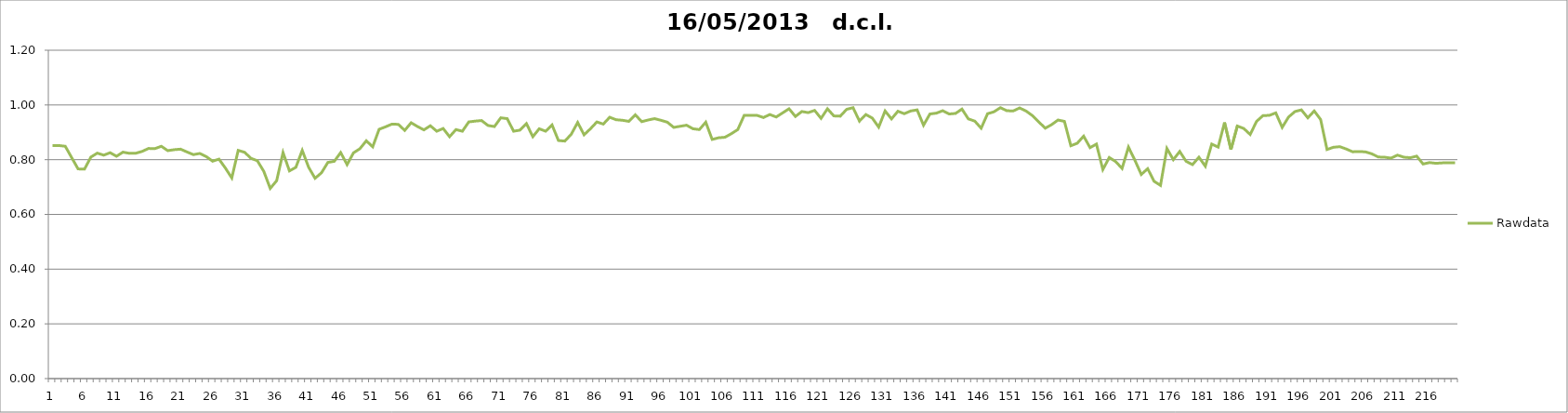
| Category | Rawdata |
|---|---|
| 0 | 0.852 |
| 1 | 0.852 |
| 2 | 0.849 |
| 3 | 0.808 |
| 4 | 0.766 |
| 5 | 0.766 |
| 6 | 0.81 |
| 7 | 0.824 |
| 8 | 0.817 |
| 9 | 0.826 |
| 10 | 0.813 |
| 11 | 0.828 |
| 12 | 0.823 |
| 13 | 0.824 |
| 14 | 0.83 |
| 15 | 0.841 |
| 16 | 0.841 |
| 17 | 0.849 |
| 18 | 0.833 |
| 19 | 0.837 |
| 20 | 0.839 |
| 21 | 0.828 |
| 22 | 0.819 |
| 23 | 0.823 |
| 24 | 0.812 |
| 25 | 0.795 |
| 26 | 0.802 |
| 27 | 0.769 |
| 28 | 0.733 |
| 29 | 0.834 |
| 30 | 0.827 |
| 31 | 0.805 |
| 32 | 0.796 |
| 33 | 0.757 |
| 34 | 0.695 |
| 35 | 0.723 |
| 36 | 0.826 |
| 37 | 0.759 |
| 38 | 0.772 |
| 39 | 0.834 |
| 40 | 0.772 |
| 41 | 0.732 |
| 42 | 0.752 |
| 43 | 0.79 |
| 44 | 0.794 |
| 45 | 0.826 |
| 46 | 0.782 |
| 47 | 0.825 |
| 48 | 0.84 |
| 49 | 0.869 |
| 50 | 0.847 |
| 51 | 0.911 |
| 52 | 0.92 |
| 53 | 0.93 |
| 54 | 0.929 |
| 55 | 0.907 |
| 56 | 0.935 |
| 57 | 0.921 |
| 58 | 0.909 |
| 59 | 0.924 |
| 60 | 0.904 |
| 61 | 0.914 |
| 62 | 0.884 |
| 63 | 0.91 |
| 64 | 0.904 |
| 65 | 0.938 |
| 66 | 0.941 |
| 67 | 0.943 |
| 68 | 0.925 |
| 69 | 0.921 |
| 70 | 0.953 |
| 71 | 0.95 |
| 72 | 0.904 |
| 73 | 0.908 |
| 74 | 0.932 |
| 75 | 0.884 |
| 76 | 0.913 |
| 77 | 0.904 |
| 78 | 0.927 |
| 79 | 0.87 |
| 80 | 0.868 |
| 81 | 0.893 |
| 82 | 0.936 |
| 83 | 0.891 |
| 84 | 0.913 |
| 85 | 0.938 |
| 86 | 0.93 |
| 87 | 0.955 |
| 88 | 0.946 |
| 89 | 0.944 |
| 90 | 0.94 |
| 91 | 0.964 |
| 92 | 0.939 |
| 93 | 0.945 |
| 94 | 0.95 |
| 95 | 0.944 |
| 96 | 0.937 |
| 97 | 0.918 |
| 98 | 0.922 |
| 99 | 0.926 |
| 100 | 0.913 |
| 101 | 0.91 |
| 102 | 0.937 |
| 103 | 0.874 |
| 104 | 0.88 |
| 105 | 0.882 |
| 106 | 0.895 |
| 107 | 0.91 |
| 108 | 0.962 |
| 109 | 0.962 |
| 110 | 0.962 |
| 111 | 0.954 |
| 112 | 0.965 |
| 113 | 0.956 |
| 114 | 0.971 |
| 115 | 0.986 |
| 116 | 0.958 |
| 117 | 0.976 |
| 118 | 0.972 |
| 119 | 0.98 |
| 120 | 0.951 |
| 121 | 0.986 |
| 122 | 0.96 |
| 123 | 0.959 |
| 124 | 0.984 |
| 125 | 0.99 |
| 126 | 0.941 |
| 127 | 0.965 |
| 128 | 0.952 |
| 129 | 0.919 |
| 130 | 0.978 |
| 131 | 0.949 |
| 132 | 0.977 |
| 133 | 0.968 |
| 134 | 0.978 |
| 135 | 0.982 |
| 136 | 0.926 |
| 137 | 0.967 |
| 138 | 0.97 |
| 139 | 0.979 |
| 140 | 0.967 |
| 141 | 0.969 |
| 142 | 0.985 |
| 143 | 0.949 |
| 144 | 0.941 |
| 145 | 0.915 |
| 146 | 0.968 |
| 147 | 0.975 |
| 148 | 0.99 |
| 149 | 0.979 |
| 150 | 0.978 |
| 151 | 0.989 |
| 152 | 0.978 |
| 153 | 0.961 |
| 154 | 0.938 |
| 155 | 0.915 |
| 156 | 0.928 |
| 157 | 0.945 |
| 158 | 0.94 |
| 159 | 0.851 |
| 160 | 0.86 |
| 161 | 0.886 |
| 162 | 0.844 |
| 163 | 0.857 |
| 164 | 0.764 |
| 165 | 0.808 |
| 166 | 0.793 |
| 167 | 0.768 |
| 168 | 0.846 |
| 169 | 0.798 |
| 170 | 0.746 |
| 171 | 0.767 |
| 172 | 0.721 |
| 173 | 0.706 |
| 174 | 0.841 |
| 175 | 0.8 |
| 176 | 0.83 |
| 177 | 0.794 |
| 178 | 0.782 |
| 179 | 0.809 |
| 180 | 0.776 |
| 181 | 0.857 |
| 182 | 0.846 |
| 183 | 0.936 |
| 184 | 0.837 |
| 185 | 0.923 |
| 186 | 0.914 |
| 187 | 0.892 |
| 188 | 0.94 |
| 189 | 0.961 |
| 190 | 0.962 |
| 191 | 0.971 |
| 192 | 0.918 |
| 193 | 0.956 |
| 194 | 0.976 |
| 195 | 0.982 |
| 196 | 0.953 |
| 197 | 0.978 |
| 198 | 0.947 |
| 199 | 0.837 |
| 200 | 0.845 |
| 201 | 0.848 |
| 202 | 0.839 |
| 203 | 0.829 |
| 204 | 0.83 |
| 205 | 0.828 |
| 206 | 0.821 |
| 207 | 0.81 |
| 208 | 0.809 |
| 209 | 0.806 |
| 210 | 0.817 |
| 211 | 0.809 |
| 212 | 0.807 |
| 213 | 0.813 |
| 214 | 0.784 |
| 215 | 0.789 |
| 216 | 0.787 |
| 217 | 0.788 |
| 218 | 0.788 |
| 219 | 0.788 |